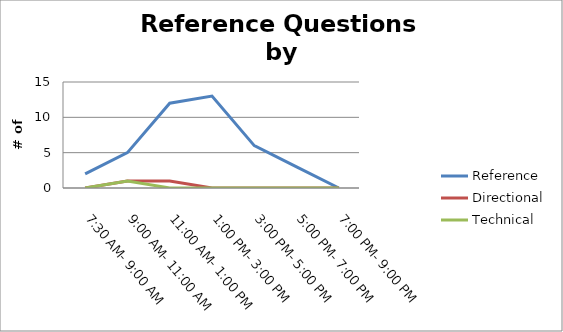
| Category | Reference | Directional | Technical |
|---|---|---|---|
| 7:30 AM- 9:00 AM | 2 | 0 | 0 |
| 9:00 AM- 11:00 AM | 5 | 1 | 1 |
| 11:00 AM- 1:00 PM | 12 | 1 | 0 |
| 1:00 PM- 3:00 PM | 13 | 0 | 0 |
| 3:00 PM- 5:00 PM | 6 | 0 | 0 |
| 5:00 PM- 7:00 PM | 3 | 0 | 0 |
| 7:00 PM- 9:00 PM | 0 | 0 | 0 |